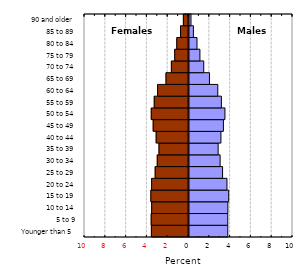
| Category | Male |
|---|---|
| Younger than 5 | 3.73 |
| 5 to 9 | 3.729 |
| 10 to 14 | 3.738 |
| 15 to 19 | 3.818 |
| 20 to 24 | 3.65 |
| 25 to 29 | 3.228 |
| 30 to 34 | 2.993 |
| 35 to 39 | 2.802 |
| 40 to 44 | 3.07 |
| 45 to 49 | 3.309 |
| 50 to 54 | 3.455 |
| 55 to 59 | 3.114 |
| 60 to 64 | 2.769 |
| 65 to 69 | 1.968 |
| 70 to 74 | 1.418 |
| 75 to 79 | 1.049 |
| 80 to 84 | 0.769 |
| 85 to 89 | 0.423 |
| 90 and older | 0.191 |